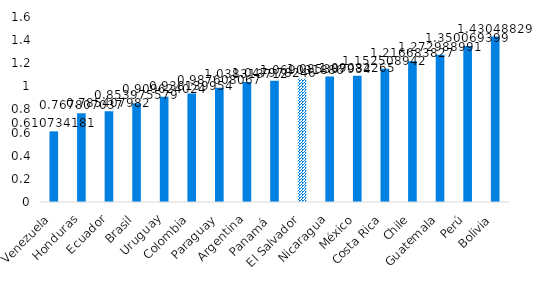
| Category | Series 0 |
|---|---|
| Venezuela | 0.611 |
| Honduras | 0.768 |
| Ecuador | 0.785 |
| Brasil | 0.854 |
| Uruguay | 0.91 |
| Colombia | 0.938 |
| Paraguay | 0.988 |
| Argentina | 1.038 |
| Panamá  | 1.048 |
| El Salvador | 1.069 |
| Nicaragua | 1.085 |
| México | 1.091 |
| Costa Rica | 1.153 |
| Chile | 1.217 |
| Guatemala | 1.273 |
| Perú | 1.35 |
| Bolivia | 1.43 |